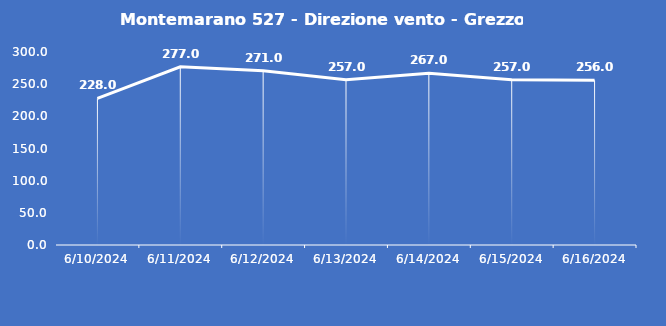
| Category | Montemarano 527 - Direzione vento - Grezzo (°N) |
|---|---|
| 6/10/24 | 228 |
| 6/11/24 | 277 |
| 6/12/24 | 271 |
| 6/13/24 | 257 |
| 6/14/24 | 267 |
| 6/15/24 | 257 |
| 6/16/24 | 256 |